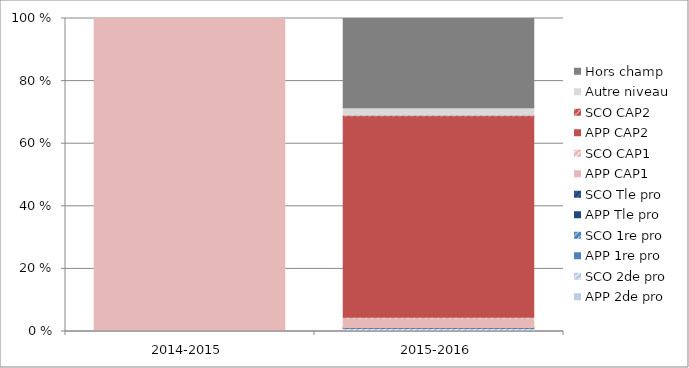
| Category | APP 2de pro | SCO 2de pro | APP 1re pro | SCO 1re pro | APP Tle pro | SCO Tle pro | APP CAP1 | SCO CAP1 | APP CAP2 | SCO CAP2 | Autre niveau | Hors champ |
|---|---|---|---|---|---|---|---|---|---|---|---|---|
| 2014-2015 | 0 | 0 | 0 | 0 | 0 | 0 | 100 | 0 | 0 | 0 | 0 | 0 |
| 2015-2016 | 0.11 | 0.62 | 0.19 | 0.22 | 0.01 | 0.05 | 3.05 | 0.3 | 64.3 | 0.25 | 2.36 | 28.54 |